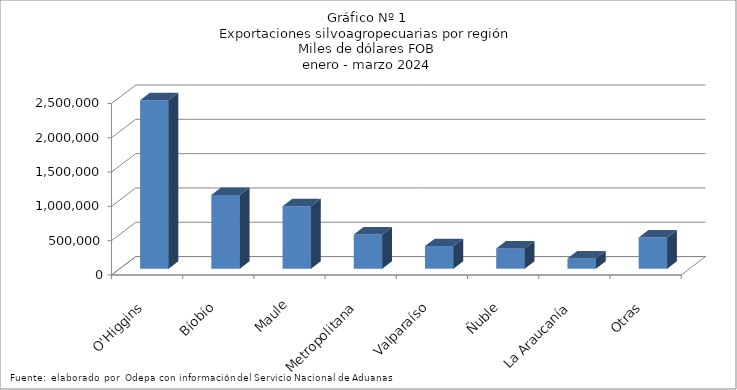
| Category | Series 0 |
|---|---|
| O'Higgins | 2455589.298 |
| Bíobío | 1074551.487 |
| Maule | 910112.204 |
| Metropolitana | 498461.358 |
| Valparaíso | 330127.326 |
| Ñuble | 295805.351 |
| La Araucanía | 149886.861 |
| Otras | 454735.289 |